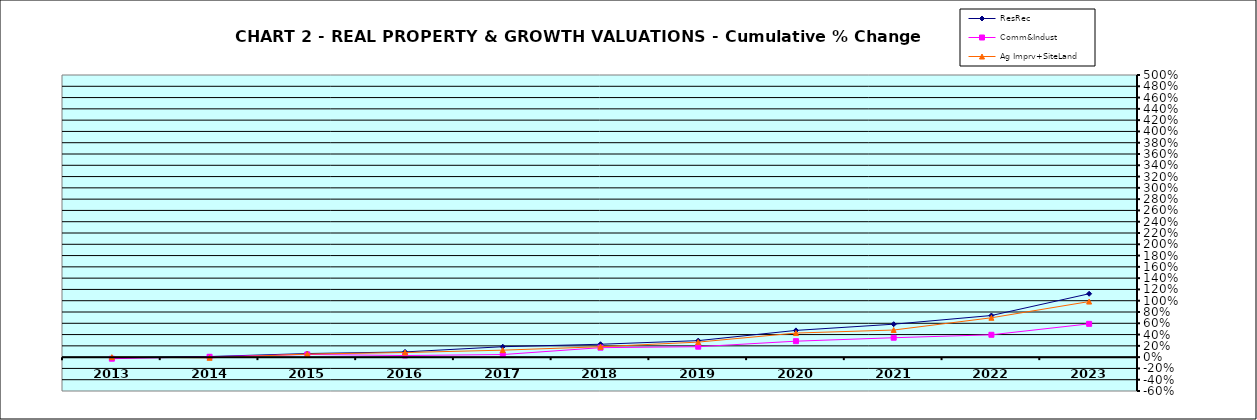
| Category | ResRec | Comm&Indust | Ag Imprv+SiteLand |
|---|---|---|---|
| 2013.0 | -0.013 | -0.027 | 0 |
| 2014.0 | 0.011 | 0.007 | -0.012 |
| 2015.0 | 0.064 | 0.048 | 0.054 |
| 2016.0 | 0.093 | 0.029 | 0.082 |
| 2017.0 | 0.185 | 0.046 | 0.124 |
| 2018.0 | 0.229 | 0.168 | 0.185 |
| 2019.0 | 0.293 | 0.185 | 0.266 |
| 2020.0 | 0.474 | 0.283 | 0.427 |
| 2021.0 | 0.584 | 0.344 | 0.481 |
| 2022.0 | 0.738 | 0.396 | 0.698 |
| 2023.0 | 1.123 | 0.59 | 0.985 |